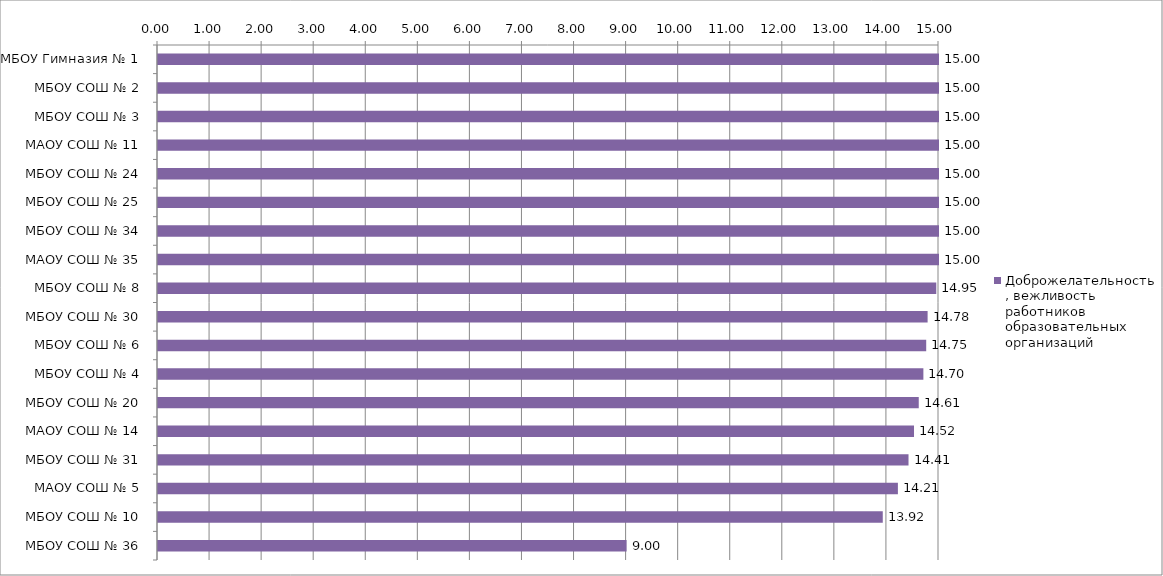
| Category | Доброжелательность, вежливость работников образовательных организаций |
|---|---|
| МБОУ Гимназия № 1 | 15 |
| МБОУ СОШ № 2 | 15 |
| МБОУ СОШ № 3 | 15 |
| МАОУ СОШ № 11 | 15 |
| МБОУ СОШ № 24 | 15 |
| МБОУ СОШ № 25 | 15 |
| МБОУ СОШ № 34 | 15 |
| МАОУ СОШ № 35 | 15 |
| МБОУ СОШ № 8 | 14.948 |
| МБОУ СОШ № 30 | 14.781 |
| МБОУ СОШ № 6 | 14.754 |
| МБОУ СОШ № 4 | 14.7 |
| МБОУ СОШ № 20 | 14.611 |
| МАОУ СОШ № 14 | 14.52 |
| МБОУ СОШ № 31 | 14.415 |
| МАОУ СОШ № 5 | 14.211 |
| МБОУ СОШ № 10 | 13.92 |
| МБОУ СОШ № 36 | 9 |